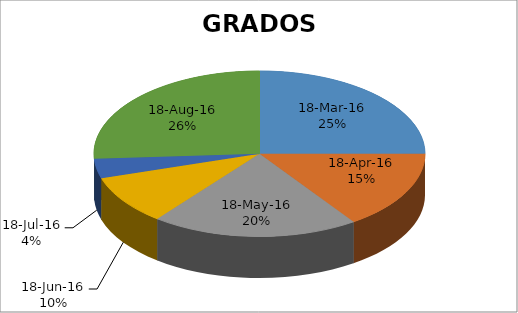
| Category | Series 0 |
|---|---|
| 42447.0 | 26 |
| 42509.0 | 16 |
| 42573.0 | 21 |
| 42636.0 | 10 |
| 42692.0 | 4 |
| 42719.0 | 27 |